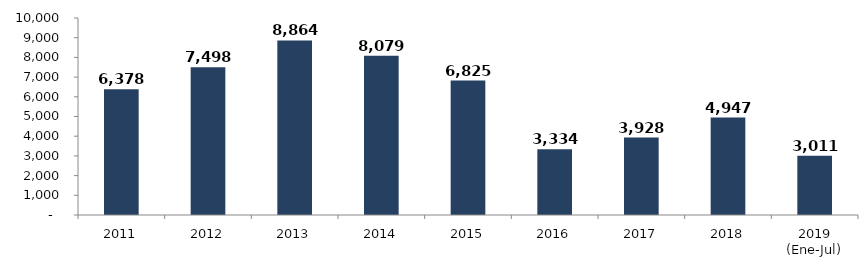
| Category | Series 0 |
|---|---|
| 2011 | 6377.615 |
| 2012 | 7498.207 |
| 2013 | 8863.622 |
| 2014 | 8079.21 |
| 2015 | 6824.624 |
| 2016 | 3333.564 |
| 2017 | 3928.017 |
| 2018 | 4947.435 |
| 2019 (Ene-Jul) | 3011.025 |